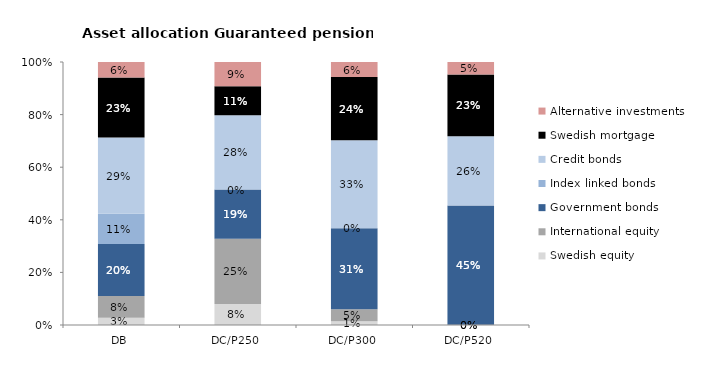
| Category | Swedish equity | International equity | Government bonds | Index linked bonds | Credit bonds | Swedish mortgage | Alternative investments |
|---|---|---|---|---|---|---|---|
| DB | 0.028 | 0.082 | 0.198 | 0.115 | 0.289 | 0.228 | 0.059 |
| DC/P250 | 0.08 | 0.248 | 0.187 | 0 | 0.283 | 0.109 | 0.093 |
| DC/P300 | 0.015 | 0.045 | 0.308 | 0 | 0.335 | 0.24 | 0.057 |
| DC/P520 | 0 | 0 | 0.453 | 0 | 0.264 | 0.234 | 0.048 |